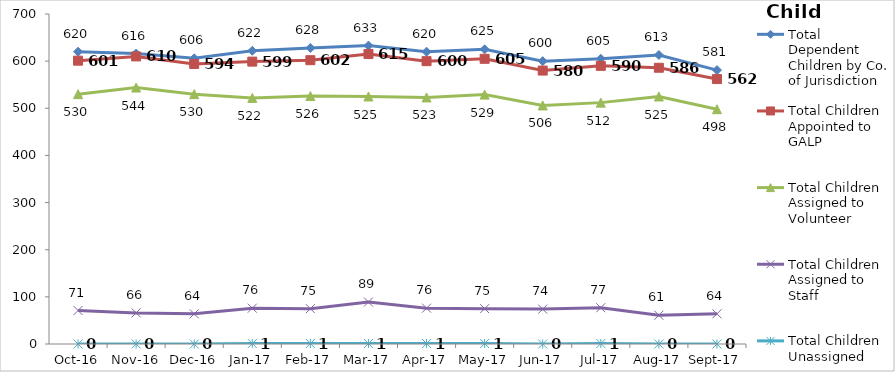
| Category | Total Dependent Children by Co. of Jurisdiction | Total Children Appointed to GALP | Total Children Assigned to Volunteer | Total Children Assigned to Staff | Total Children Unassigned |
|---|---|---|---|---|---|
| 2016-10-01 | 620 | 601 | 530 | 71 | 0 |
| 2016-11-01 | 616 | 610 | 544 | 66 | 0 |
| 2016-12-01 | 606 | 594 | 530 | 64 | 0 |
| 2017-01-01 | 622 | 599 | 522 | 76 | 1 |
| 2017-02-01 | 628 | 602 | 526 | 75 | 1 |
| 2017-03-01 | 633 | 615 | 525 | 89 | 1 |
| 2017-04-01 | 620 | 600 | 523 | 76 | 1 |
| 2017-05-01 | 625 | 605 | 529 | 75 | 1 |
| 2017-06-01 | 600 | 580 | 506 | 74 | 0 |
| 2017-07-01 | 605 | 590 | 512 | 77 | 1 |
| 2017-08-01 | 613 | 586 | 525 | 61 | 0 |
| 2017-09-01 | 581 | 562 | 498 | 64 | 0 |